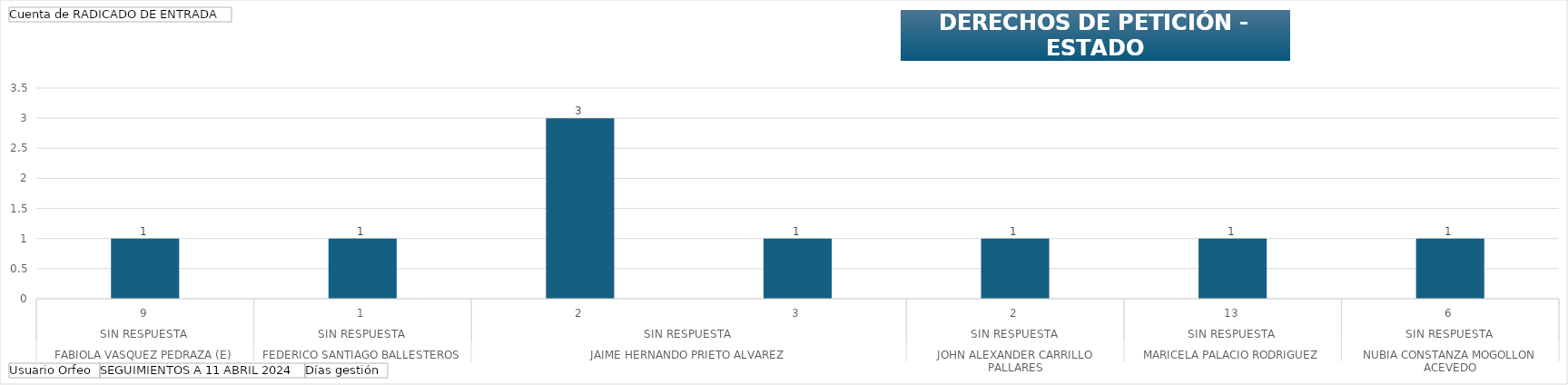
| Category | Total |
|---|---|
| 0 | 1 |
| 1 | 1 |
| 2 | 3 |
| 3 | 1 |
| 4 | 1 |
| 5 | 1 |
| 6 | 1 |